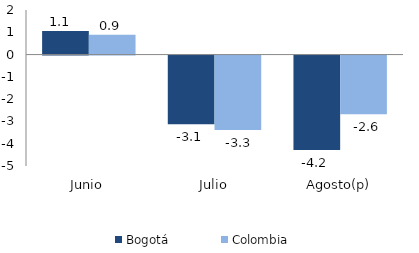
| Category | Bogotá | Colombia |
|---|---|---|
| Junio | 1.056 | 0.89 |
| Julio | -3.081 | -3.344 |
| Agosto(p) | -4.234 | -2.629 |